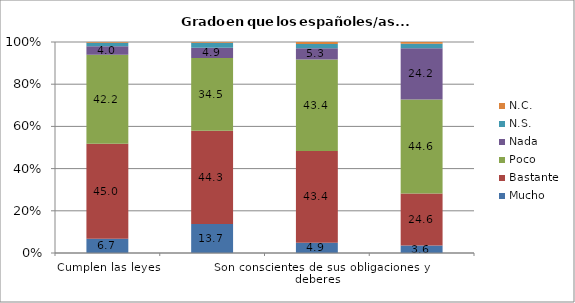
| Category | Mucho  | Bastante | Poco | Nada | N.S. | N.C. |
|---|---|---|---|---|---|---|
| Cumplen las leyes | 6.7 | 45 | 42.2 | 4 | 1.6 | 0.4 |
| Son exigentes con sus derechos | 13.7 | 44.3 | 34.5 | 4.9 | 2.3 | 0.4 |
| Son conscientes de sus obligaciones y deberes | 4.9 | 43.4 | 43.4 | 5.3 | 2 | 1 |
| Son iguales ante la ley | 3.6 | 24.6 | 44.6 | 24.2 | 2.2 | 0.8 |